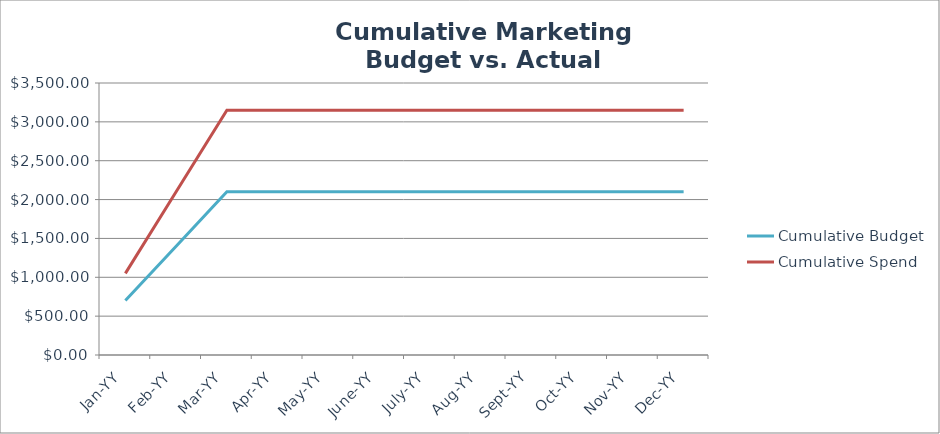
| Category | Cumulative Budget | Cumulative Spend |
|---|---|---|
| Jan-YY | 700 | 1050 |
| Feb-YY | 1400 | 2100 |
| Mar-YY | 2100 | 3150 |
| Apr-YY | 2100 | 3150 |
| May-YY | 2100 | 3150 |
| June-YY | 2100 | 3150 |
| July-YY | 2100 | 3150 |
| Aug-YY | 2100 | 3150 |
| Sept-YY | 2100 | 3150 |
| Oct-YY | 2100 | 3150 |
| Nov-YY | 2100 | 3150 |
| Dec-YY | 2100 | 3150 |